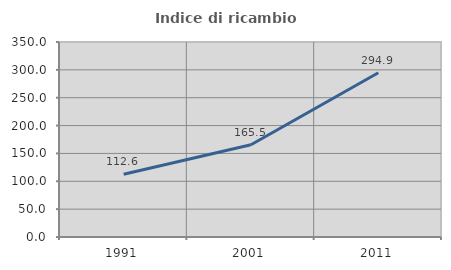
| Category | Indice di ricambio occupazionale  |
|---|---|
| 1991.0 | 112.613 |
| 2001.0 | 165.517 |
| 2011.0 | 294.872 |